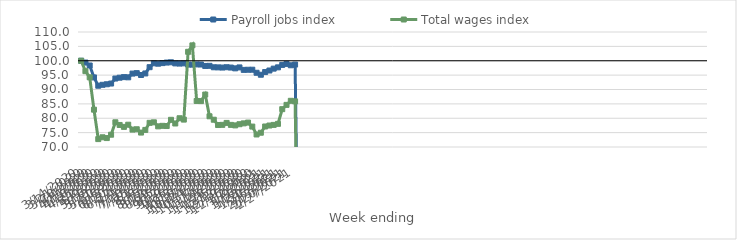
| Category | Payroll jobs index | Total wages index |
|---|---|---|
| 14/03/2020 | 100 | 100 |
| 21/03/2020 | 99.374 | 96.376 |
| 28/03/2020 | 98.35 | 94.239 |
| 04/04/2020 | 94.202 | 82.992 |
| 11/04/2020 | 91.312 | 72.75 |
| 18/04/2020 | 91.631 | 73.378 |
| 25/04/2020 | 91.824 | 73.106 |
| 02/05/2020 | 92.073 | 74.275 |
| 09/05/2020 | 93.812 | 78.597 |
| 16/05/2020 | 94.106 | 77.667 |
| 23/05/2020 | 94.309 | 76.998 |
| 30/05/2020 | 94.235 | 77.753 |
| 06/06/2020 | 95.535 | 76.05 |
| 13/06/2020 | 95.695 | 76.173 |
| 20/06/2020 | 95.043 | 75.02 |
| 27/06/2020 | 95.58 | 75.944 |
| 04/07/2020 | 97.765 | 78.406 |
| 11/07/2020 | 99.111 | 78.586 |
| 18/07/2020 | 98.973 | 77.181 |
| 25/07/2020 | 99.182 | 77.362 |
| 01/08/2020 | 99.371 | 77.294 |
| 08/08/2020 | 99.464 | 79.458 |
| 15/08/2020 | 99.078 | 78.177 |
| 22/08/2020 | 99.017 | 80 |
| 29/08/2020 | 99.092 | 79.53 |
| 05/09/2020 | 98.674 | 103.113 |
| 12/09/2020 | 98.651 | 105.345 |
| 19/09/2020 | 98.727 | 86.011 |
| 26/09/2020 | 98.689 | 85.966 |
| 03/10/2020 | 98.186 | 88.246 |
| 10/10/2020 | 98.229 | 80.684 |
| 17/10/2020 | 97.731 | 79.488 |
| 24/10/2020 | 97.69 | 77.643 |
| 31/10/2020 | 97.634 | 77.706 |
| 07/11/2020 | 97.745 | 78.377 |
| 14/11/2020 | 97.634 | 77.695 |
| 21/11/2020 | 97.358 | 77.512 |
| 28/11/2020 | 97.68 | 77.924 |
| 05/12/2020 | 96.824 | 78.221 |
| 12/12/2020 | 96.868 | 78.492 |
| 19/12/2020 | 96.883 | 77.1 |
| 26/12/2020 | 95.818 | 74.356 |
| 02/01/2021 | 95.135 | 74.966 |
| 09/01/2021 | 96.069 | 77.135 |
| 16/01/2021 | 96.608 | 77.468 |
| 23/01/2021 | 97.256 | 77.687 |
| 30/01/2021 | 97.705 | 78.049 |
| 06/02/2021 | 98.553 | 83.161 |
| 13/02/2021 | 98.894 | 84.654 |
| 20/02/2021 | 98.425 | 86.069 |
| 27/02/2021 | 98.672 | 85.874 |